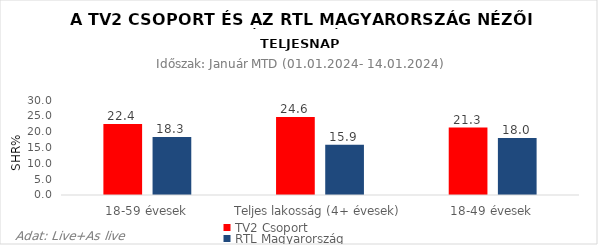
| Category | TV2 Csoport | RTL Magyarország |
|---|---|---|
| 18-59 évesek | 22.4 | 18.3 |
| Teljes lakosság (4+ évesek) | 24.6 | 15.9 |
| 18-49 évesek | 21.3 | 18 |